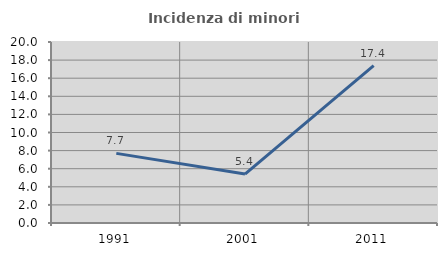
| Category | Incidenza di minori stranieri |
|---|---|
| 1991.0 | 7.692 |
| 2001.0 | 5.405 |
| 2011.0 | 17.391 |